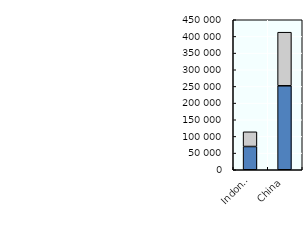
| Category | 0-14 year olds | 15-24 year olds |
|---|---|---|
| Indonesia | 69742.692 | 44122.208 |
| China | 251927.887 | 160749.902 |